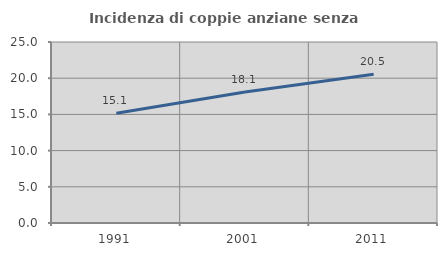
| Category | Incidenza di coppie anziane senza figli  |
|---|---|
| 1991.0 | 15.145 |
| 2001.0 | 18.086 |
| 2011.0 | 20.541 |